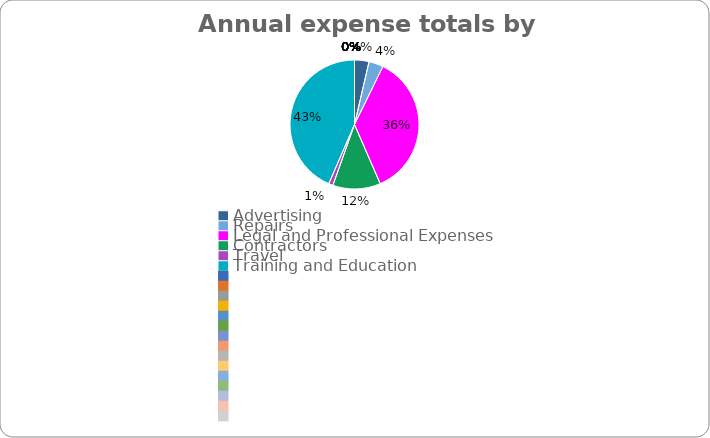
| Category | Series 0 |
|---|---|
| Advertising | 250 |
| Repairs | 250 |
| Legal and Professional Expenses | 2500 |
| Contractors | 825 |
| Travel | 75.36 |
| Training and Education | 3000 |